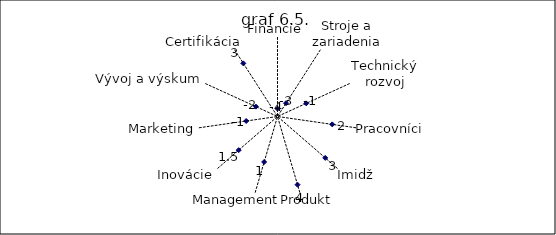
| Category | Series 0 |
|---|---|
| Financie | -4 |
| Stroje a zariadenia | -3 |
| Technický rozvoj | -1 |
| Pracovníci | 2 |
| Imidž | 3 |
| Produkt  | 4 |
| Management | 1 |
| Inovácie | 1.5 |
| Marketing | -1 |
| Vývoj a výskum | -2 |
| Certifikácia | 3 |